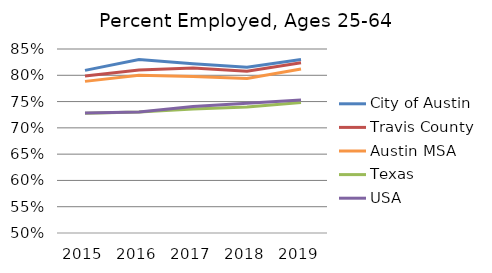
| Category | City of Austin | Travis County | Austin MSA | Texas | USA |
|---|---|---|---|---|---|
| 2015.0 | 0.809 | 0.799 | 0.788 | 0.728 | 0.728 |
| 2016.0 | 0.83 | 0.81 | 0.8 | 0.73 | 0.73 |
| 2017.0 | 0.822 | 0.814 | 0.798 | 0.736 | 0.741 |
| 2018.0 | 0.815 | 0.808 | 0.794 | 0.74 | 0.747 |
| 2019.0 | 0.83 | 0.824 | 0.812 | 0.748 | 0.753 |